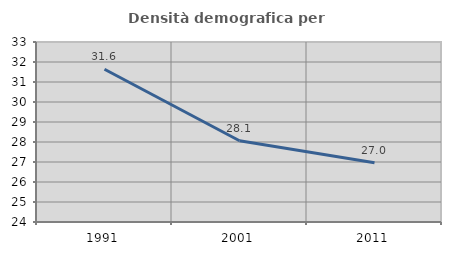
| Category | Densità demografica |
|---|---|
| 1991.0 | 31.637 |
| 2001.0 | 28.063 |
| 2011.0 | 26.959 |